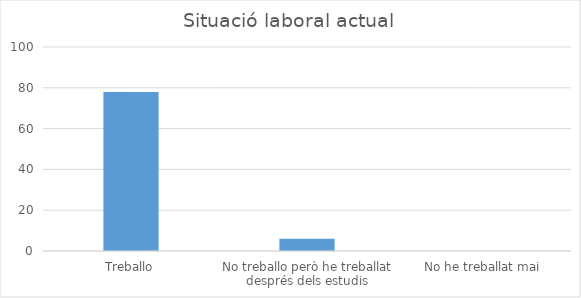
| Category | Series 0 |
|---|---|
| Treballo | 78 |
| No treballo però he treballat després dels estudis | 6 |
| No he treballat mai | 0 |